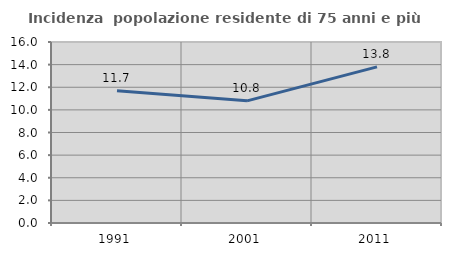
| Category | Incidenza  popolazione residente di 75 anni e più |
|---|---|
| 1991.0 | 11.694 |
| 2001.0 | 10.799 |
| 2011.0 | 13.801 |